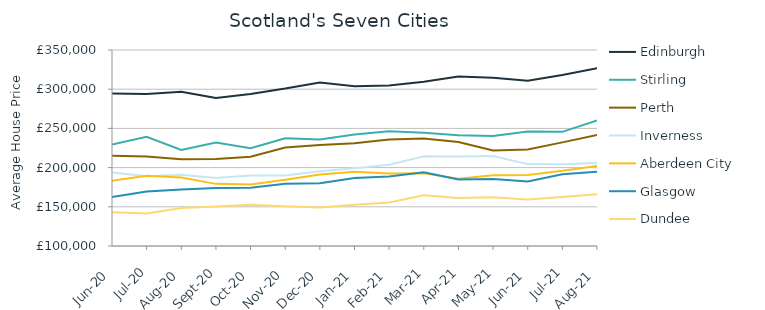
| Category | Edinburgh | Stirling | Perth | Inverness | Aberdeen City | Glasgow | Dundee |
|---|---|---|---|---|---|---|---|
| 2020-06-01 | 294405.336 | 229502.932 | 215170.84 | 193687.171 | 183274.596 | 162347.046 | 142968.562 |
| 2020-07-01 | 294028.698 | 239315.35 | 214228.893 | 188932.995 | 189625.385 | 169557.614 | 141564.902 |
| 2020-08-01 | 296732.239 | 222619.493 | 210691.134 | 190723.767 | 187376.969 | 171910.048 | 148449.903 |
| 2020-09-01 | 288791.379 | 232059.399 | 210950.234 | 186894.18 | 179259.058 | 174105.42 | 150309.739 |
| 2020-10-01 | 294022.127 | 224851.339 | 213737.449 | 189782.053 | 178388.136 | 174262.926 | 152520.103 |
| 2020-11-01 | 300846.524 | 237325.458 | 225693.741 | 190070.6 | 184437.771 | 179492.227 | 150721.171 |
| 2020-12-01 | 308674.867 | 235759.36 | 228938.946 | 195459.575 | 191160.342 | 180070.695 | 149085.747 |
| 2021-01-01 | 303665.494 | 242108.03 | 231104.013 | 199160.206 | 194746.382 | 186762.977 | 152507.839 |
| 2021-02-01 | 304668.448 | 246511.879 | 235978.757 | 203584.772 | 192421.225 | 188591.942 | 155517.214 |
| 2021-03-01 | 309391.94 | 244354.919 | 237151.54 | 214492.699 | 192755.646 | 194052.103 | 164661.847 |
| 2021-04-01 | 316086.385 | 241262.992 | 232554.987 | 214056.944 | 185870.654 | 184974.646 | 161221.388 |
| 2021-05-01 | 314677.883 | 240176.682 | 221913.566 | 214690.831 | 190121.858 | 185346.018 | 162135.95 |
| 2021-06-01 | 310797.739 | 245921.966 | 223077.275 | 204449.518 | 190592.74 | 182414.906 | 159249.603 |
| 2021-07-01 | 318077.193 | 245588.65 | 232150.612 | 204391.994 | 195851.871 | 191439.629 | 162496.721 |
| 2021-08-01 | 326655.425 | 260121.58 | 241567.911 | 205945.097 | 202189.278 | 194701.214 | 166016.785 |